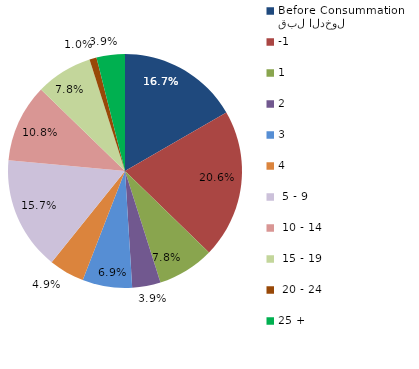
| Category | Series 0 |
|---|---|
| قبل الدخول
Before Consummation | 16.667 |
| -1 | 20.588 |
| 1 | 7.843 |
| 2 | 3.922 |
| 3 | 6.863 |
| 4 | 4.902 |
|  5 - 9 | 15.686 |
|  10 - 14 | 10.784 |
|  15 - 19 | 7.843 |
|  20 - 24 | 0.98 |
| 25 + | 3.922 |